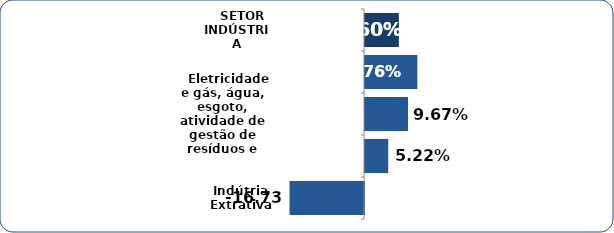
| Category | Series 0 |
|---|---|
|    Indútria Extrativa | -0.167 |
|    Indústria de Transformação  | 0.052 |
|    Eletricidade e gás, água, esgoto, atividade de gestão de resíduos e descontaminação | 0.097 |
|    Construção | 0.118 |
|    SETOR INDÚSTRIA | 0.076 |